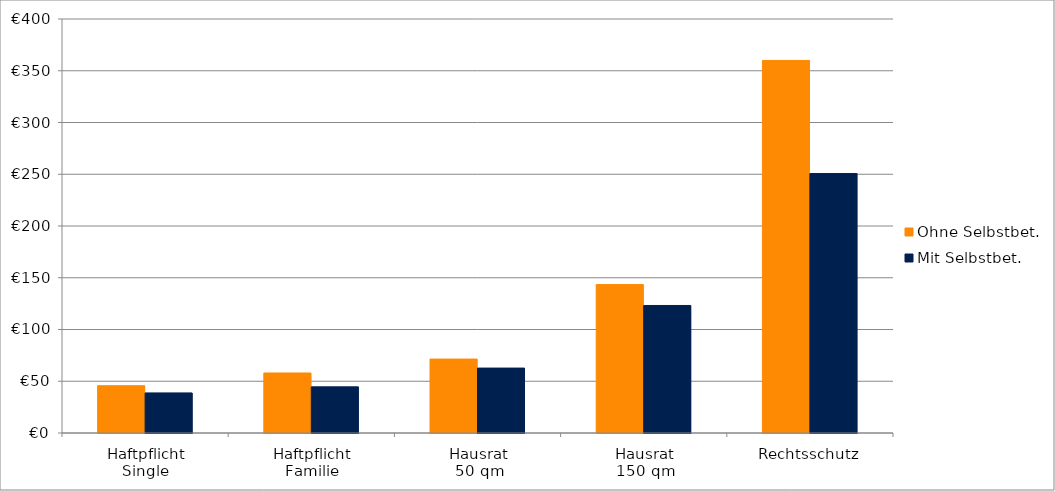
| Category | Ohne Selbstbet. | Mit Selbstbet. |
|---|---|---|
| Haftpflicht
Single | 45.668 | 38.736 |
| Haftpflicht
Familie | 57.994 | 44.59 |
| Hausrat
50 qm | 71.43 | 62.722 |
| Hausrat
150 qm | 143.392 | 123.204 |
| Rechtsschutz | 359.938 | 250.69 |